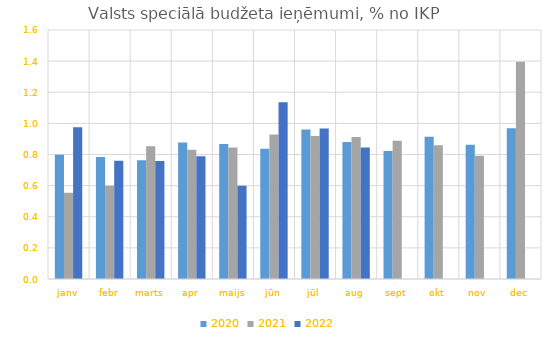
| Category | 2020 | 2021 | 2022 |
|---|---|---|---|
| janv | 0.798 | 0.554 | 0.975 |
| febr | 0.784 | 0.599 | 0.759 |
| marts | 0.763 | 0.853 | 0.758 |
| apr | 0.877 | 0.83 | 0.788 |
| maijs | 0.868 | 0.844 | 0.599 |
| jūn | 0.838 | 0.928 | 1.136 |
| jūl | 0.961 | 0.919 | 0.966 |
| aug | 0.88 | 0.912 | 0.846 |
| sept | 0.822 | 0.889 | 0 |
| okt | 0.913 | 0.859 | 0 |
| nov | 0.863 | 0.792 | 0 |
| dec | 0.969 | 1.396 | 0 |